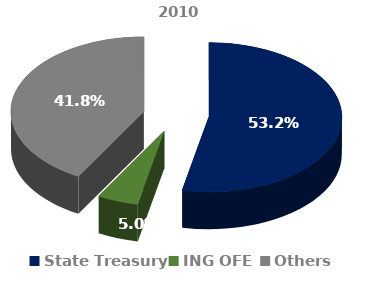
| Category | 2010 | Series 1 |
|---|---|---|
| State Treasury | 0.532 |  |
| ING OFE | 0.05 |  |
| Others | 0.418 |  |